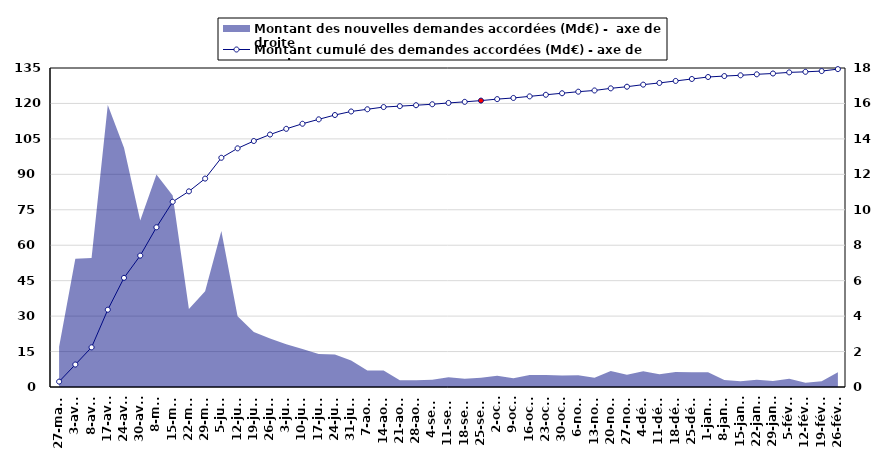
| Category | Montant cumulé des demandes accordées (Md€) - axe de gauche |
|---|---|
| 2020-03-27 | 2.278 |
| 2020-04-03 | 9.509 |
| 2020-04-08 | 16.785 |
| 2020-04-17 | 32.7 |
| 2020-04-24 | 46.2 |
| 2020-04-30 | 55.6 |
| 2020-05-08 | 67.59 |
| 2020-05-15 | 78.4 |
| 2020-05-22 | 82.8 |
| 2020-05-29 | 88.2 |
| 2020-06-05 | 97.003 |
| 2020-06-12 | 100.998 |
| 2020-06-19 | 104.1 |
| 2020-06-26 | 106.837 |
| 2020-07-03 | 109.256 |
| 2020-07-10 | 111.403 |
| 2020-07-17 | 113.272 |
| 2020-07-24 | 115.104 |
| 2020-07-31 | 116.6 |
| 2020-08-07 | 117.536 |
| 2020-08-14 | 118.472 |
| 2020-08-21 | 118.859 |
| 2020-08-28 | 119.246 |
| 2020-09-04 | 119.658 |
| 2020-09-11 | 120.212 |
| 2020-09-18 | 120.678 |
| 2020-09-25 | 121.202 |
| 2020-10-02 | 121.832 |
| 2020-10-09 | 122.324 |
| 2020-10-16 | 122.995 |
| 2020-10-23 | 123.668 |
| 2020-10-30 | 124.315 |
| 2020-11-06 | 124.975 |
| 2020-11-13 | 125.492 |
| 2020-11-20 | 126.391 |
| 2020-11-27 | 127.078 |
| 2020-12-04 | 127.961 |
| 2020-12-11 | 128.675 |
| 2020-12-18 | 129.523 |
| 2020-12-25 | 130.358 |
| 2021-01-01 | 131.193 |
| 2021-01-08 | 131.59 |
| 2021-01-15 | 131.918 |
| 2021-01-22 | 132.331 |
| 2021-01-29 | 132.675 |
| 2021-02-05 | 133.145 |
| 2021-02-12 | 133.38 |
| 2021-02-19 | 133.7 |
| 2021-02-26 | 134.53 |